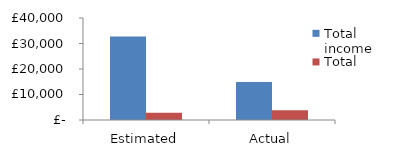
| Category | Total income | Total expenses |
|---|---|---|
| Estimated | 32750 | 2800 |
| Actual | 14910 | 3800 |